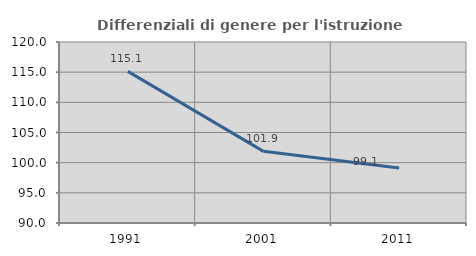
| Category | Differenziali di genere per l'istruzione superiore |
|---|---|
| 1991.0 | 115.127 |
| 2001.0 | 101.875 |
| 2011.0 | 99.11 |